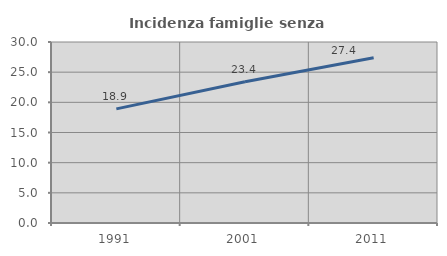
| Category | Incidenza famiglie senza nuclei |
|---|---|
| 1991.0 | 18.914 |
| 2001.0 | 23.398 |
| 2011.0 | 27.387 |